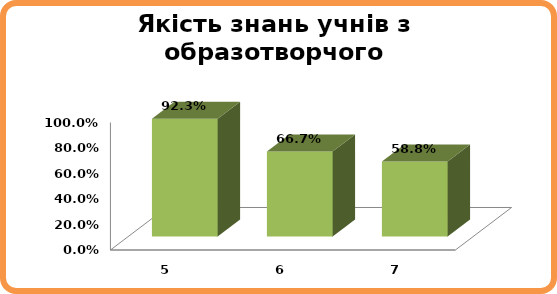
| Category | Series 0 |
|---|---|
| 5.0 | 0.923 |
| 6.0 | 0.667 |
| 7.0 | 0.588 |